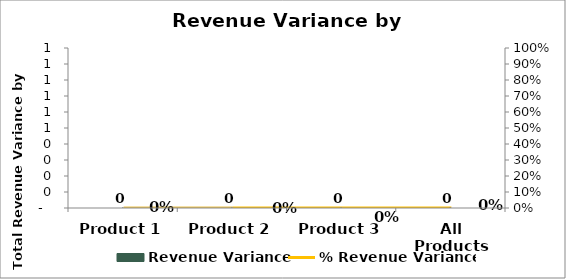
| Category | Revenue Variance  |
|---|---|
| Product 1 | 0 |
| Product 2 | 0 |
| Product 3 | 0 |
| All Products | 0 |